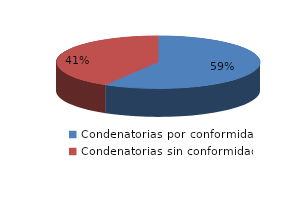
| Category | Series 0 |
|---|---|
| 0 | 424 |
| 1 | 300 |